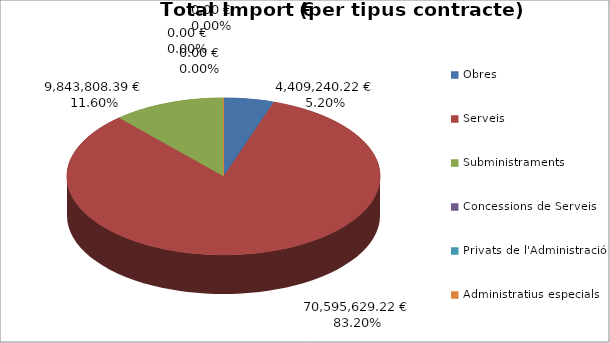
| Category | Total preu              (amb iva) |
|---|---|
| Obres | 4409240.221 |
| Serveis | 70595629.216 |
| Subministraments | 9843808.39 |
| Concessions de Serveis | 0 |
| Privats de l'Administració | 0 |
| Administratius especials | 0 |